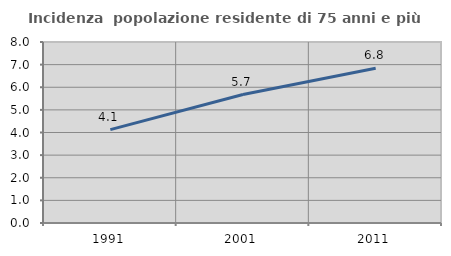
| Category | Incidenza  popolazione residente di 75 anni e più |
|---|---|
| 1991.0 | 4.127 |
| 2001.0 | 5.677 |
| 2011.0 | 6.841 |